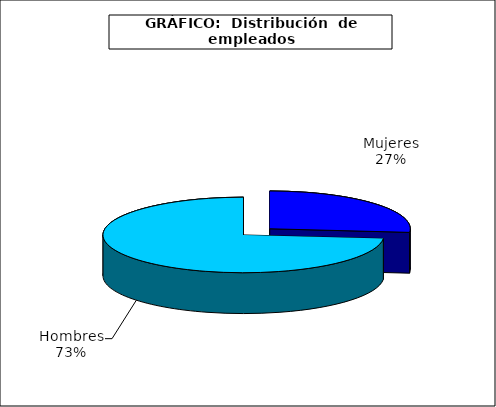
| Category | persona |
|---|---|
| 0 | 3012.723 |
| 1 | 8351.018 |